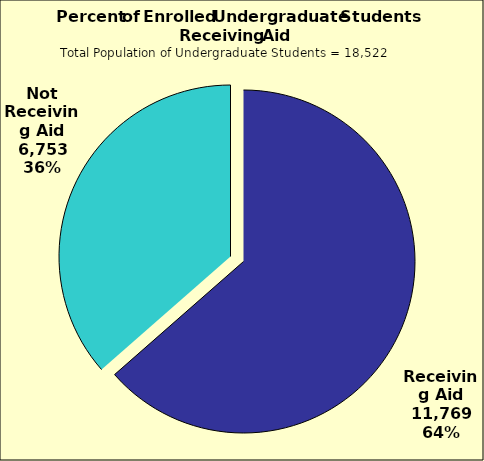
| Category | Series 0 |
|---|---|
| Receiving Aid | 11769 |
| Not Receiving Aid | 6753 |